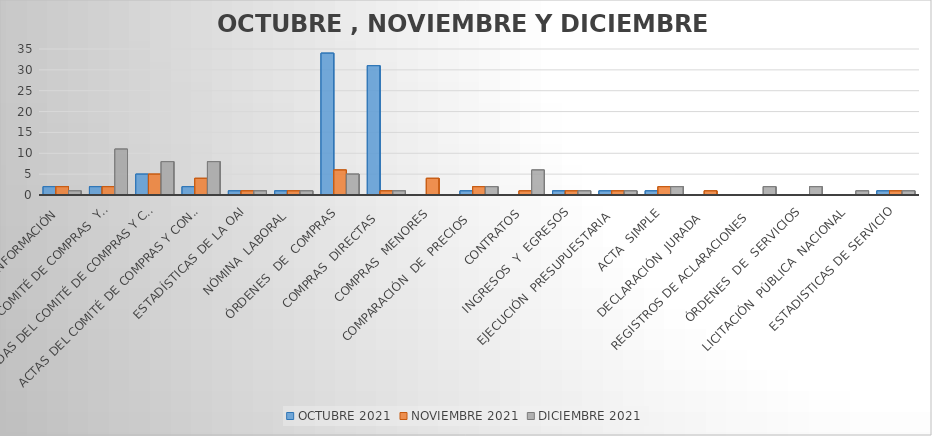
| Category | OCTUBRE 2021 | NOVIEMBRE 2021 | DICIEMBRE 2021 |
|---|---|---|---|
| SOLICITUDES DE INFORMACIÓN  | 2 | 2 | 1 |
| REUNIONES DEL COMITÉ DE COMPRAS  Y  CONTRATACIONES | 2 | 2 | 11 |
| AGENDAS DEL COMITÉ DE COMPRAS Y CONTRATACIONES | 5 | 5 | 8 |
| ACTAS DEL COMITÉ DE COMPRAS Y CONTRATACIONES | 2 | 4 | 8 |
| ESTADÍSTICAS DE LA OAI | 1 | 1 | 1 |
| NÓMINA  LABORAL  | 1 | 1 | 1 |
| ÓRDENES  DE  COMPRAS | 34 | 6 | 5 |
| COMPRAS  DIRECTAS   | 31 | 1 | 1 |
| COMPRAS  MENORES | 0 | 4 | 0 |
| COMPARACIÓN  DE  PRECIOS   | 1 | 2 | 2 |
| CONTRATOS | 0 | 1 | 6 |
| INGRESOS  Y  EGRESOS | 1 | 1 | 1 |
| EJECUCIÓN  PRESUPUESTARIA   | 1 | 1 | 1 |
| ACTA  SIMPLE | 1 | 2 | 2 |
| DECLARACIÓN  JURADA   | 0 | 1 | 0 |
| REGISTROS DE ACLARACIONES   | 0 | 0 | 2 |
| ÓRDENES  DE  SERVICIOS | 0 | 0 | 2 |
| LICITACIÓN  PÚBLICA  NACIONAL | 0 | 0 | 1 |
| ESTADISTICAS DE SERVICIO | 1 | 1 | 1 |